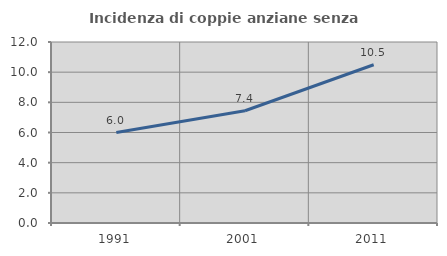
| Category | Incidenza di coppie anziane senza figli  |
|---|---|
| 1991.0 | 5.996 |
| 2001.0 | 7.441 |
| 2011.0 | 10.493 |